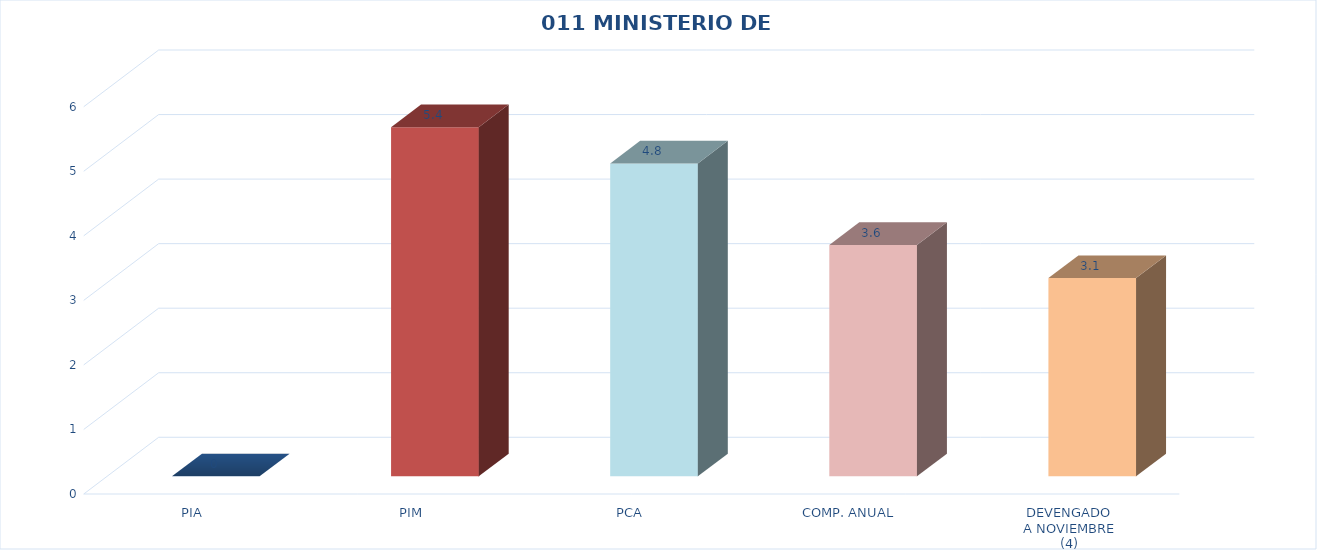
| Category | 011 MINISTERIO DE SALUD |
|---|---|
| PIA | 0 |
| PIM | 5.408 |
| PCA | 4.848 |
| COMP. ANUAL | 3.584 |
| DEVENGADO
A NOVIEMBRE
(4) | 3.071 |